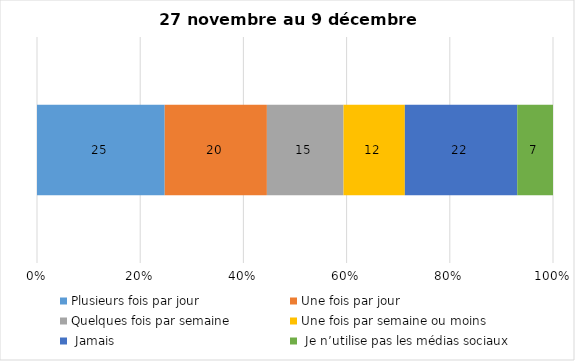
| Category | Plusieurs fois par jour | Une fois par jour | Quelques fois par semaine   | Une fois par semaine ou moins   |  Jamais   |  Je n’utilise pas les médias sociaux |
|---|---|---|---|---|---|---|
| 0 | 25 | 20 | 15 | 12 | 22 | 7 |